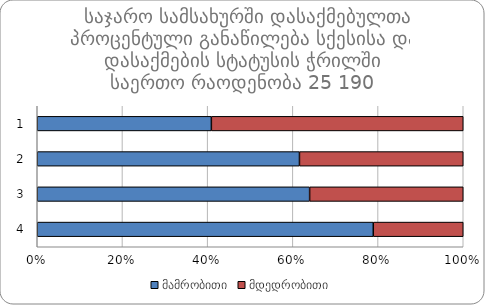
| Category |  მამრობითი |  მდედრობითი |
|---|---|---|
| 0 | 6474 | 9365 |
| 1 | 3237 | 2022 |
| 2 | 1899 | 1071 |
| 3 | 885 | 237 |